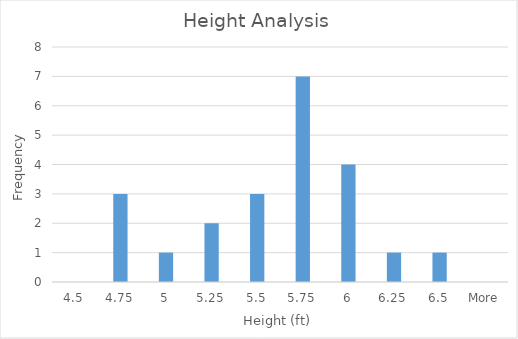
| Category | Frequency |
|---|---|
| 4.5 | 0 |
| 4.75 | 3 |
| 5 | 1 |
| 5.25 | 2 |
| 5.5 | 3 |
| 5.75 | 7 |
| 6 | 4 |
| 6.25 | 1 |
| 6.5 | 1 |
| More | 0 |